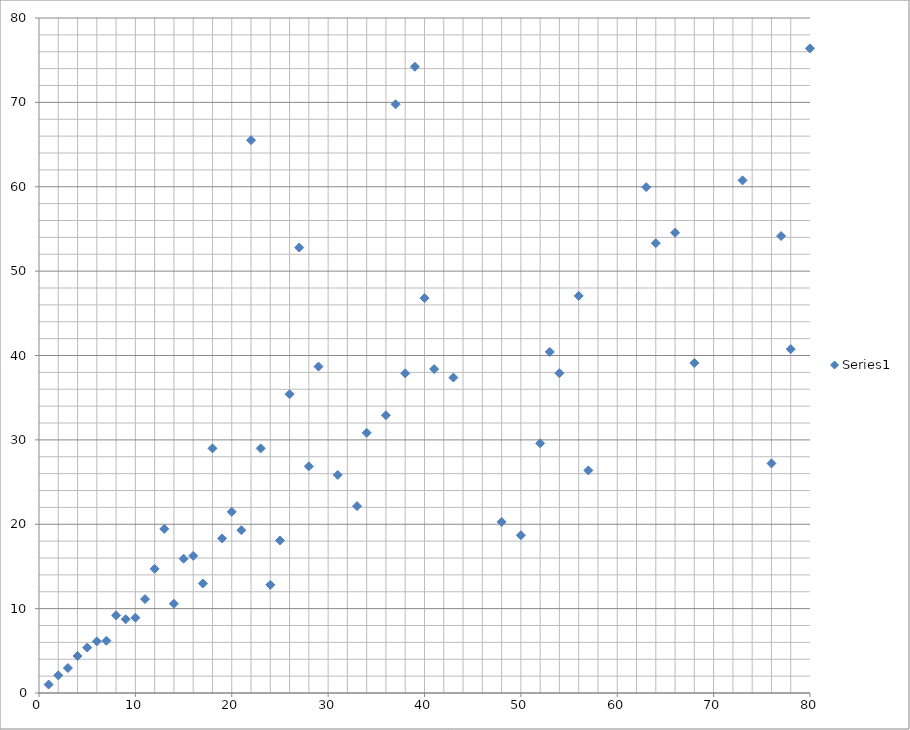
| Category | Series 0 |
|---|---|
| 1.0 | 1 |
| 2.0 | 2.096 |
| 3.0 | 2.956 |
| 4.0 | 4.392 |
| 5.0 | 5.384 |
| 6.0 | 6.114 |
| 7.0 | 6.196 |
| 8.0 | 9.204 |
| 9.0 | 8.741 |
| 10.0 | 8.923 |
| 11.0 | 11.135 |
| 12.0 | 14.715 |
| 13.0 | 19.445 |
| 14.0 | 10.57 |
| 15.0 | 15.918 |
| 16.0 | 16.25 |
| 17.0 | 12.985 |
| 18.0 | 28.989 |
| 19.0 | 18.318 |
| 20.0 | 21.475 |
| 21.0 | 19.29 |
| 22.0 | 65.514 |
| 23.0 | 28.99 |
| 24.0 | 12.814 |
| 25.0 | 18.076 |
| 26.0 | 35.413 |
| 27.0 | 52.795 |
| 28.0 | 26.866 |
| 29.0 | 38.691 |
| 30.0 | 353.824 |
| 31.0 | 25.841 |
| 32.0 | 230.661 |
| 33.0 | 22.152 |
| 34.0 | 30.839 |
| 35.0 | 84.319 |
| 36.0 | 32.92 |
| 37.0 | 69.77 |
| 38.0 | 37.883 |
| 39.0 | 74.221 |
| 40.0 | 46.8 |
| 41.0 | 38.389 |
| 42.0 | 1305.118 |
| 43.0 | 37.383 |
| 44.0 | 119.312 |
| 45.0 | 170.751 |
| 46.0 | 114.536 |
| 47.0 | 157.676 |
| 48.0 | 20.278 |
| 49.0 | 1534.245 |
| 50.0 | 18.7 |
| 51.0 | 12236.102 |
| 52.0 | 29.594 |
| 53.0 | 40.425 |
| 54.0 | 37.901 |
| 55.0 | 125.704 |
| 56.0 | 47.061 |
| 57.0 | 26.38 |
| 58.0 | 4955.795 |
| 59.0 | 420.072 |
| 60.0 | 5659.231 |
| 61.0 | 284.082 |
| 62.0 | 385.885 |
| 63.0 | 59.952 |
| 64.0 | 53.315 |
| 65.0 | 84.719 |
| 66.0 | 54.556 |
| 67.0 | 644.371 |
| 68.0 | 39.11 |
| 69.0 | 85.706 |
| 70.0 | 2376.833 |
| 71.0 | 320.974 |
| 72.0 | 3167.109 |
| 73.0 | 60.753 |
| 74.0 | 48401.049 |
| 75.0 | 725.38 |
| 76.0 | 27.212 |
| 77.0 | 54.156 |
| 78.0 | 40.752 |
| 79.0 | 96.148 |
| 80.0 | 76.399 |